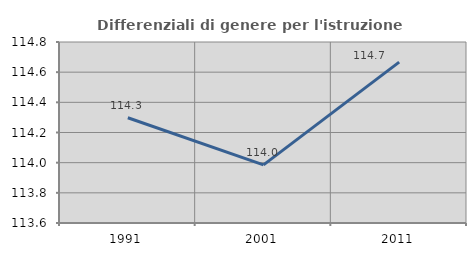
| Category | Differenziali di genere per l'istruzione superiore |
|---|---|
| 1991.0 | 114.298 |
| 2001.0 | 113.985 |
| 2011.0 | 114.667 |